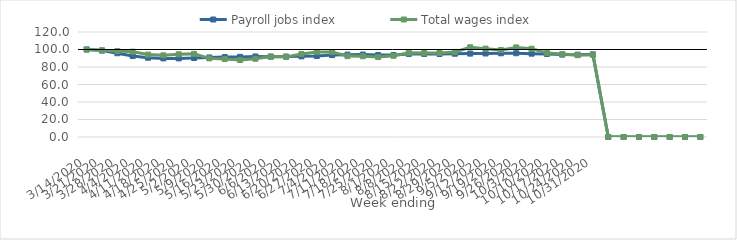
| Category | Payroll jobs index | Total wages index |
|---|---|---|
| 14/03/2020 | 100 | 100 |
| 21/03/2020 | 98.778 | 99.05 |
| 28/03/2020 | 95.733 | 98.193 |
| 04/04/2020 | 92.532 | 97.51 |
| 11/04/2020 | 90.61 | 94.184 |
| 18/04/2020 | 89.822 | 93.328 |
| 25/04/2020 | 89.822 | 94.524 |
| 02/05/2020 | 90.254 | 94.996 |
| 09/05/2020 | 90.905 | 89.856 |
| 16/05/2020 | 91.296 | 89.079 |
| 23/05/2020 | 91.563 | 87.953 |
| 30/05/2020 | 92.009 | 89.421 |
| 06/06/2020 | 91.804 | 91.967 |
| 13/06/2020 | 91.939 | 91.581 |
| 20/06/2020 | 92.163 | 94.939 |
| 27/06/2020 | 92.555 | 97.094 |
| 04/07/2020 | 93.638 | 97.039 |
| 11/07/2020 | 94.134 | 92.464 |
| 18/07/2020 | 94.22 | 92.285 |
| 25/07/2020 | 93.609 | 91.322 |
| 01/08/2020 | 93.629 | 92.829 |
| 08/08/2020 | 94.966 | 96.25 |
| 15/08/2020 | 94.978 | 95.953 |
| 22/08/2020 | 94.87 | 96.06 |
| 29/08/2020 | 95.175 | 97.219 |
| 05/09/2020 | 95.309 | 102.546 |
| 12/09/2020 | 95.462 | 100.948 |
| 19/09/2020 | 95.685 | 99.392 |
| 26/09/2020 | 95.768 | 102.389 |
| 03/10/2020 | 95.252 | 100.843 |
| 10/10/2020 | 94.912 | 96.128 |
| 17/10/2020 | 94.179 | 94.721 |
| 24/10/2020 | 94.089 | 93.557 |
| 31/10/2020 | 94.435 | 93.982 |